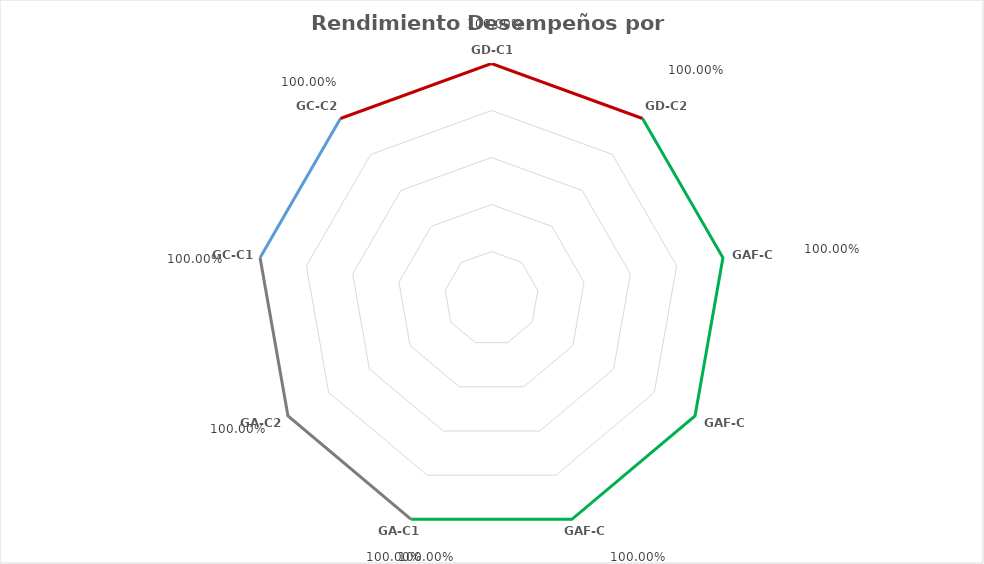
| Category | Series 0 |
|---|---|
| GD-C1 | 1 |
| GD-C2 | 1 |
| GAF-C1 | 1 |
| GAF-C2 | 1 |
| GAF-C3 | 1 |
| GA-C1 | 1 |
| GA-C2 | 1 |
| GC-C1 | 1 |
| GC-C2 | 1 |